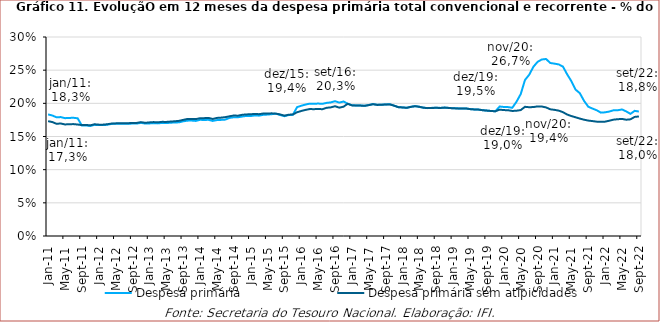
| Category | Despesa primária | Despesa primária sem atipicidades |
|---|---|---|
| 2011-01-01 | 0.183 | 0.173 |
| 2011-02-01 | 0.182 | 0.172 |
| 2011-03-01 | 0.179 | 0.169 |
| 2011-04-01 | 0.179 | 0.17 |
| 2011-05-01 | 0.178 | 0.168 |
| 2011-06-01 | 0.178 | 0.169 |
| 2011-07-01 | 0.178 | 0.169 |
| 2011-08-01 | 0.177 | 0.168 |
| 2011-09-01 | 0.166 | 0.167 |
| 2011-10-01 | 0.167 | 0.167 |
| 2011-11-01 | 0.166 | 0.167 |
| 2011-12-01 | 0.168 | 0.168 |
| 2012-01-01 | 0.167 | 0.168 |
| 2012-02-01 | 0.167 | 0.168 |
| 2012-03-01 | 0.168 | 0.168 |
| 2012-04-01 | 0.169 | 0.17 |
| 2012-05-01 | 0.169 | 0.17 |
| 2012-06-01 | 0.169 | 0.17 |
| 2012-07-01 | 0.169 | 0.17 |
| 2012-08-01 | 0.169 | 0.17 |
| 2012-09-01 | 0.169 | 0.17 |
| 2012-10-01 | 0.169 | 0.17 |
| 2012-11-01 | 0.171 | 0.172 |
| 2012-12-01 | 0.169 | 0.171 |
| 2013-01-01 | 0.17 | 0.171 |
| 2013-02-01 | 0.17 | 0.172 |
| 2013-03-01 | 0.17 | 0.171 |
| 2013-04-01 | 0.17 | 0.172 |
| 2013-05-01 | 0.17 | 0.172 |
| 2013-06-01 | 0.171 | 0.173 |
| 2013-07-01 | 0.171 | 0.173 |
| 2013-08-01 | 0.171 | 0.174 |
| 2013-09-01 | 0.173 | 0.175 |
| 2013-10-01 | 0.174 | 0.176 |
| 2013-11-01 | 0.174 | 0.176 |
| 2013-12-01 | 0.173 | 0.176 |
| 2014-01-01 | 0.175 | 0.177 |
| 2014-02-01 | 0.175 | 0.178 |
| 2014-03-01 | 0.175 | 0.178 |
| 2014-04-01 | 0.173 | 0.176 |
| 2014-05-01 | 0.175 | 0.178 |
| 2014-06-01 | 0.175 | 0.178 |
| 2014-07-01 | 0.175 | 0.179 |
| 2014-08-01 | 0.178 | 0.181 |
| 2014-09-01 | 0.179 | 0.182 |
| 2014-10-01 | 0.179 | 0.181 |
| 2014-11-01 | 0.18 | 0.183 |
| 2014-12-01 | 0.181 | 0.183 |
| 2015-01-01 | 0.181 | 0.184 |
| 2015-02-01 | 0.182 | 0.184 |
| 2015-03-01 | 0.181 | 0.184 |
| 2015-04-01 | 0.183 | 0.185 |
| 2015-05-01 | 0.183 | 0.185 |
| 2015-06-01 | 0.184 | 0.185 |
| 2015-07-01 | 0.184 | 0.184 |
| 2015-08-01 | 0.182 | 0.183 |
| 2015-09-01 | 0.181 | 0.181 |
| 2015-10-01 | 0.182 | 0.183 |
| 2015-11-01 | 0.183 | 0.183 |
| 2015-12-01 | 0.194 | 0.187 |
| 2016-01-01 | 0.196 | 0.188 |
| 2016-02-01 | 0.198 | 0.19 |
| 2016-03-01 | 0.2 | 0.191 |
| 2016-04-01 | 0.199 | 0.191 |
| 2016-05-01 | 0.2 | 0.192 |
| 2016-06-01 | 0.199 | 0.191 |
| 2016-07-01 | 0.201 | 0.193 |
| 2016-08-01 | 0.201 | 0.194 |
| 2016-09-01 | 0.203 | 0.196 |
| 2016-10-01 | 0.201 | 0.193 |
| 2016-11-01 | 0.203 | 0.195 |
| 2016-12-01 | 0.199 | 0.199 |
| 2017-01-01 | 0.197 | 0.197 |
| 2017-02-01 | 0.197 | 0.197 |
| 2017-03-01 | 0.197 | 0.197 |
| 2017-04-01 | 0.196 | 0.196 |
| 2017-05-01 | 0.197 | 0.197 |
| 2017-06-01 | 0.199 | 0.199 |
| 2017-07-01 | 0.198 | 0.198 |
| 2017-08-01 | 0.198 | 0.198 |
| 2017-09-01 | 0.198 | 0.198 |
| 2017-10-01 | 0.199 | 0.198 |
| 2017-11-01 | 0.196 | 0.196 |
| 2017-12-01 | 0.194 | 0.194 |
| 2018-01-01 | 0.194 | 0.194 |
| 2018-02-01 | 0.193 | 0.193 |
| 2018-03-01 | 0.195 | 0.195 |
| 2018-04-01 | 0.196 | 0.196 |
| 2018-05-01 | 0.195 | 0.195 |
| 2018-06-01 | 0.193 | 0.193 |
| 2018-07-01 | 0.193 | 0.193 |
| 2018-08-01 | 0.193 | 0.193 |
| 2018-09-01 | 0.193 | 0.193 |
| 2018-10-01 | 0.193 | 0.193 |
| 2018-11-01 | 0.194 | 0.194 |
| 2018-12-01 | 0.193 | 0.193 |
| 2019-01-01 | 0.193 | 0.192 |
| 2019-02-01 | 0.192 | 0.192 |
| 2019-03-01 | 0.192 | 0.192 |
| 2019-04-01 | 0.192 | 0.192 |
| 2019-05-01 | 0.191 | 0.191 |
| 2019-06-01 | 0.191 | 0.191 |
| 2019-07-01 | 0.191 | 0.191 |
| 2019-08-01 | 0.19 | 0.19 |
| 2019-09-01 | 0.189 | 0.189 |
| 2019-10-01 | 0.188 | 0.188 |
| 2019-11-01 | 0.188 | 0.188 |
| 2019-12-01 | 0.195 | 0.19 |
| 2020-01-01 | 0.195 | 0.19 |
| 2020-02-01 | 0.194 | 0.19 |
| 2020-03-01 | 0.193 | 0.189 |
| 2020-04-01 | 0.202 | 0.189 |
| 2020-05-01 | 0.214 | 0.19 |
| 2020-06-01 | 0.235 | 0.195 |
| 2020-07-01 | 0.243 | 0.194 |
| 2020-08-01 | 0.255 | 0.194 |
| 2020-09-01 | 0.263 | 0.195 |
| 2020-10-01 | 0.266 | 0.195 |
| 2020-11-01 | 0.267 | 0.194 |
| 2020-12-01 | 0.261 | 0.191 |
| 2021-01-01 | 0.26 | 0.19 |
| 2021-02-01 | 0.259 | 0.189 |
| 2021-03-01 | 0.255 | 0.187 |
| 2021-04-01 | 0.244 | 0.183 |
| 2021-05-01 | 0.233 | 0.181 |
| 2021-06-01 | 0.221 | 0.179 |
| 2021-07-01 | 0.215 | 0.177 |
| 2021-08-01 | 0.204 | 0.175 |
| 2021-09-01 | 0.195 | 0.174 |
| 2021-10-01 | 0.192 | 0.173 |
| 2021-11-01 | 0.19 | 0.172 |
| 2021-12-01 | 0.186 | 0.172 |
| 2022-01-01 | 0.186 | 0.172 |
| 2022-02-01 | 0.188 | 0.174 |
| 2022-03-01 | 0.19 | 0.175 |
| 2022-04-01 | 0.19 | 0.176 |
| 2022-05-01 | 0.191 | 0.177 |
| 2022-06-01 | 0.188 | 0.175 |
| 2022-07-01 | 0.184 | 0.176 |
| 2022-08-01 | 0.189 | 0.18 |
| 2022-09-01 | 0.188 | 0.18 |